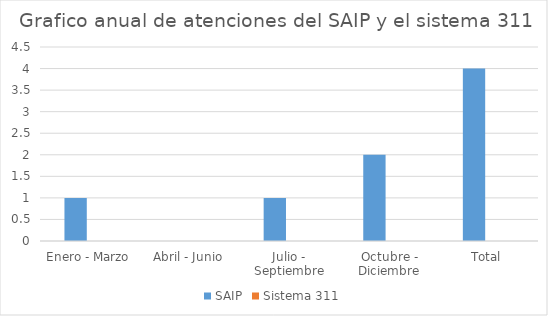
| Category | SAIP | Sistema 311 |
|---|---|---|
| Enero - Marzo | 1 | 0 |
| Abril - Junio | 0 | 0 |
| Julio - Septiembre | 1 | 0 |
| Octubre - Diciembre | 2 | 0 |
| Total | 4 | 0 |